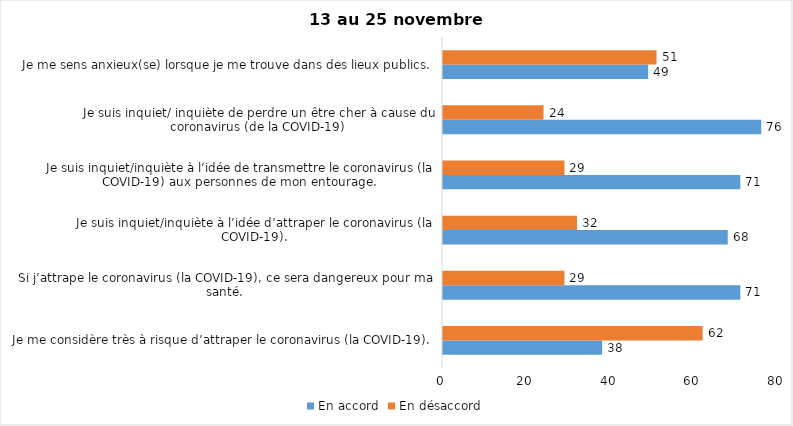
| Category | En accord | En désaccord |
|---|---|---|
| Je me considère très à risque d’attraper le coronavirus (la COVID-19). | 38 | 62 |
| Si j’attrape le coronavirus (la COVID-19), ce sera dangereux pour ma santé. | 71 | 29 |
| Je suis inquiet/inquiète à l’idée d’attraper le coronavirus (la COVID-19). | 68 | 32 |
| Je suis inquiet/inquiète à l’idée de transmettre le coronavirus (la COVID-19) aux personnes de mon entourage. | 71 | 29 |
| Je suis inquiet/ inquiète de perdre un être cher à cause du coronavirus (de la COVID-19) | 76 | 24 |
| Je me sens anxieux(se) lorsque je me trouve dans des lieux publics. | 49 | 51 |